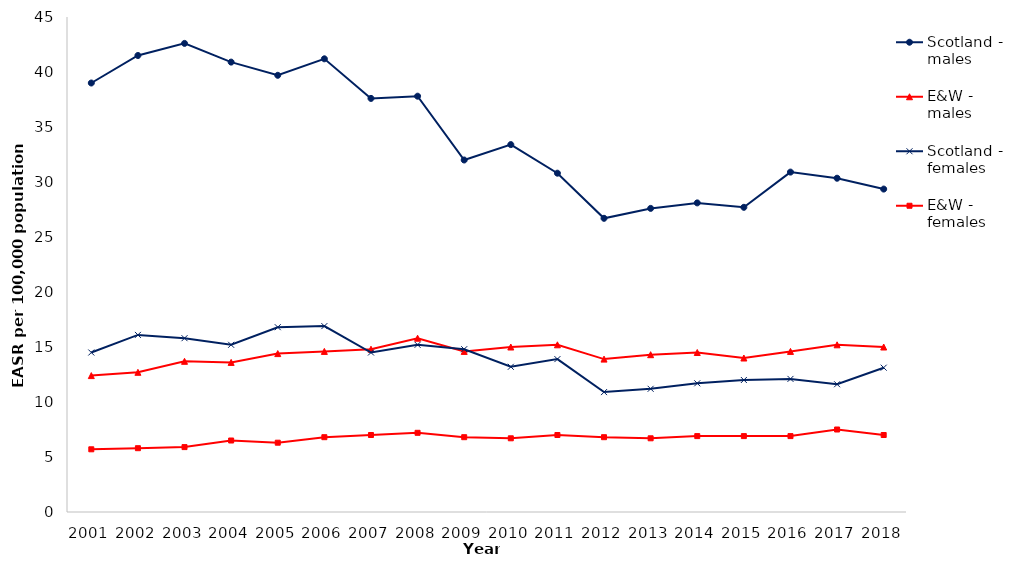
| Category | Scotland - males | E&W - males | Scotland - females | E&W - females |
|---|---|---|---|---|
| 2001.0 | 39 | 12.4 | 14.5 | 5.7 |
| 2002.0 | 41.5 | 12.7 | 16.1 | 5.8 |
| 2003.0 | 42.6 | 13.7 | 15.8 | 5.9 |
| 2004.0 | 40.9 | 13.6 | 15.2 | 6.5 |
| 2005.0 | 39.7 | 14.4 | 16.8 | 6.3 |
| 2006.0 | 41.2 | 14.6 | 16.9 | 6.8 |
| 2007.0 | 37.6 | 14.8 | 14.5 | 7 |
| 2008.0 | 37.8 | 15.8 | 15.2 | 7.2 |
| 2009.0 | 32 | 14.6 | 14.8 | 6.8 |
| 2010.0 | 33.4 | 15 | 13.2 | 6.7 |
| 2011.0 | 30.8 | 15.2 | 13.9 | 7 |
| 2012.0 | 26.7 | 13.9 | 10.9 | 6.8 |
| 2013.0 | 27.6 | 14.3 | 11.2 | 6.7 |
| 2014.0 | 28.1 | 14.5 | 11.7 | 6.9 |
| 2015.0 | 27.7 | 14 | 12 | 6.9 |
| 2016.0 | 30.9 | 14.6 | 12.1 | 6.9 |
| 2017.0 | 30.343 | 15.2 | 11.614 | 7.5 |
| 2018.0 | 29.357 | 15 | 13.12 | 7 |